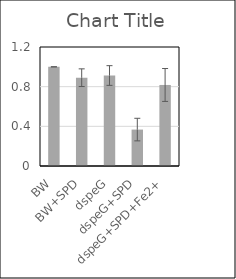
| Category | Series 0 |
|---|---|
| BW | 1 |
| BW+SPD | 0.89 |
| dspeG | 0.912 |
| dspeG+SPD | 0.367 |
| dspeG+SPD+Fe2+ | 0.817 |